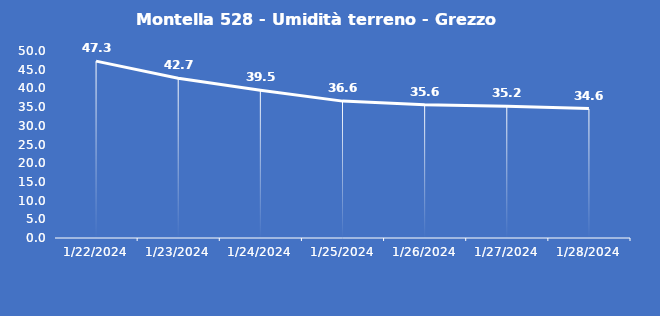
| Category | Montella 528 - Umidità terreno - Grezzo (%VWC) |
|---|---|
| 1/22/24 | 47.3 |
| 1/23/24 | 42.7 |
| 1/24/24 | 39.5 |
| 1/25/24 | 36.6 |
| 1/26/24 | 35.6 |
| 1/27/24 | 35.2 |
| 1/28/24 | 34.6 |